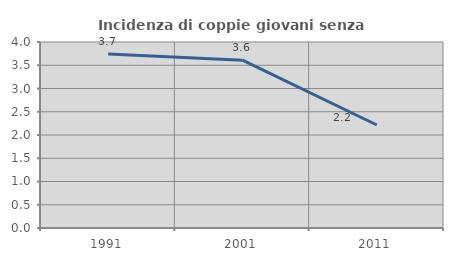
| Category | Incidenza di coppie giovani senza figli |
|---|---|
| 1991.0 | 3.741 |
| 2001.0 | 3.609 |
| 2011.0 | 2.215 |